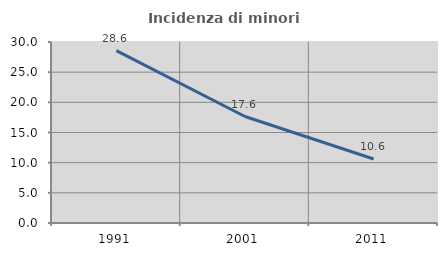
| Category | Incidenza di minori stranieri |
|---|---|
| 1991.0 | 28.571 |
| 2001.0 | 17.647 |
| 2011.0 | 10.606 |